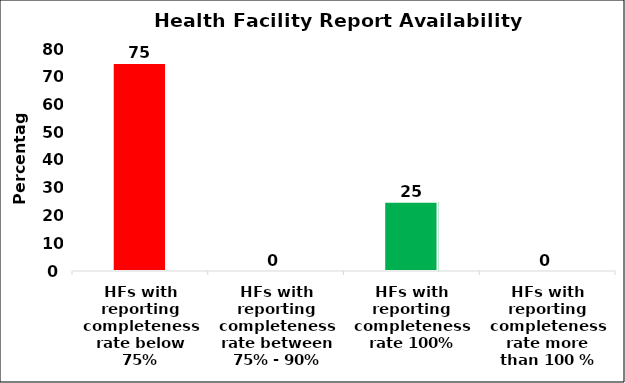
| Category | Percentage  |
|---|---|
| HFs with reporting completeness rate below 75% | 75 |
| HFs with reporting completeness rate between 75% - 90% | 0 |
| HFs with reporting completeness rate 100% | 25 |
| HFs with reporting completeness rate more than 100 % | 0 |